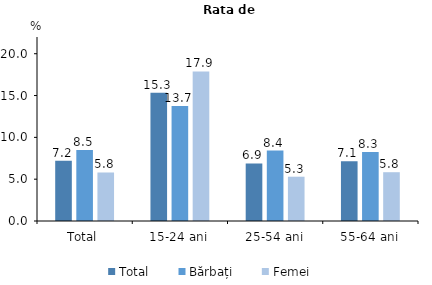
| Category | Total | Bărbați | Femei |
|---|---|---|---|
| Total | 7.2 | 8.5 | 5.8 |
| 15-24 ani | 15.333 | 13.739 | 17.889 |
| 25-54 ani | 6.881 | 8.42 | 5.295 |
| 55-64 ani | 7.13 | 8.255 | 5.834 |